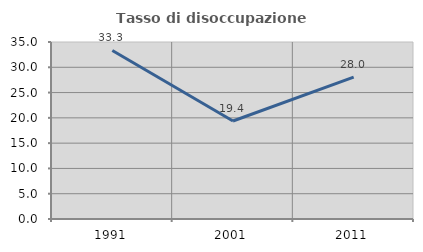
| Category | Tasso di disoccupazione giovanile  |
|---|---|
| 1991.0 | 33.333 |
| 2001.0 | 19.38 |
| 2011.0 | 28.042 |